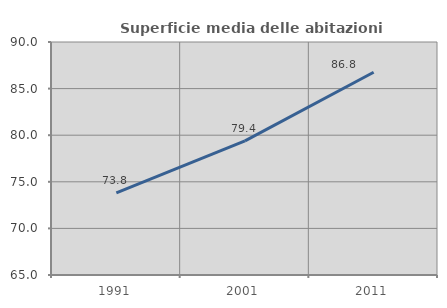
| Category | Superficie media delle abitazioni occupate |
|---|---|
| 1991.0 | 73.815 |
| 2001.0 | 79.392 |
| 2011.0 | 86.758 |